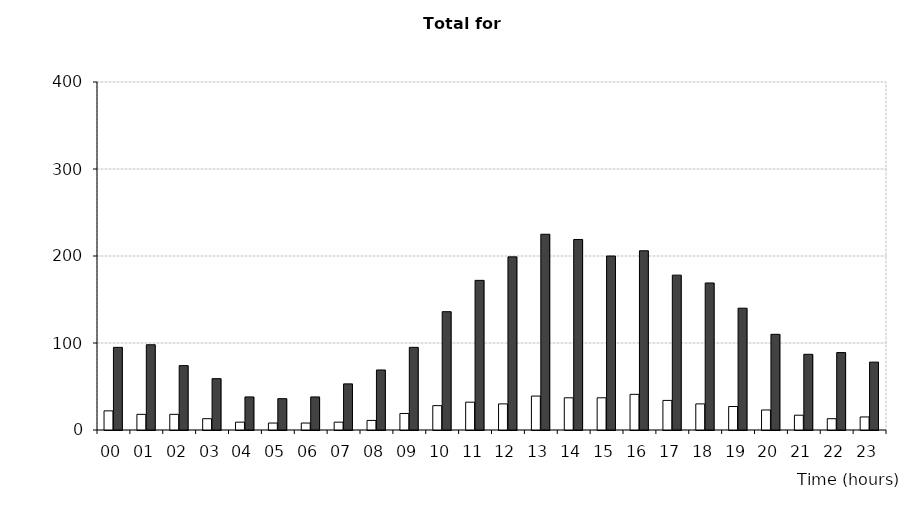
| Category | Fatal/Serious | All severities |
|---|---|---|
| 00 | 22 | 95 |
| 01 | 18 | 98 |
| 02 | 18 | 74 |
| 03 | 13 | 59 |
| 04 | 9 | 38 |
| 05 | 8 | 36 |
| 06 | 8 | 38 |
| 07 | 9 | 53 |
| 08 | 11 | 69 |
| 09 | 19 | 95 |
| 10 | 28 | 136 |
| 11 | 32 | 172 |
| 12 | 30 | 199 |
| 13 | 39 | 225 |
| 14 | 37 | 219 |
| 15 | 37 | 200 |
| 16 | 41 | 206 |
| 17 | 34 | 178 |
| 18 | 30 | 169 |
| 19 | 27 | 140 |
| 20 | 23 | 110 |
| 21 | 17 | 87 |
| 22 | 13 | 89 |
| 23 | 15 | 78 |